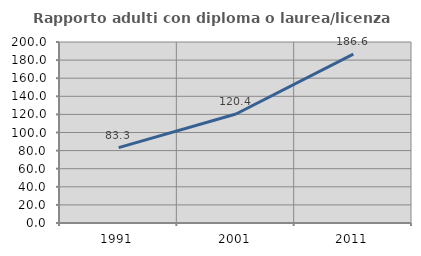
| Category | Rapporto adulti con diploma o laurea/licenza media  |
|---|---|
| 1991.0 | 83.333 |
| 2001.0 | 120.43 |
| 2011.0 | 186.572 |